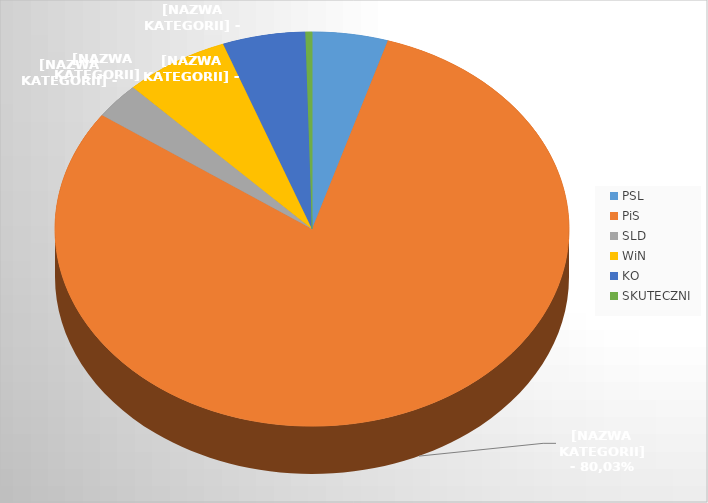
| Category | Series 0 |
|---|---|
| PSL | 195 |
| PiS | 3278 |
| SLD | 121 |
| WiN | 272 |
| KO | 213 |
| SKUTECZNI | 17 |